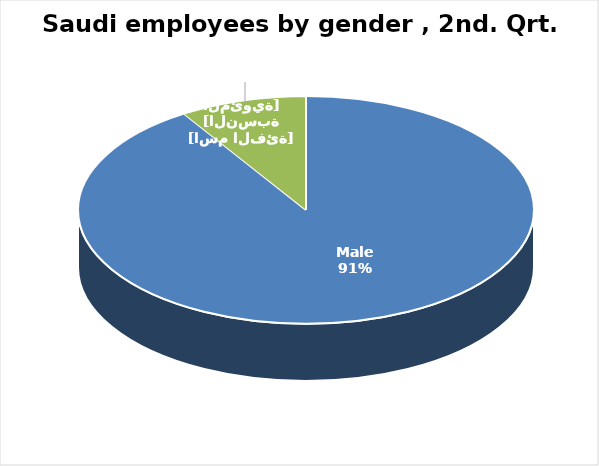
| Category | Series 0 |
|---|---|
| Male | 1628273 |
| Female | 160744 |